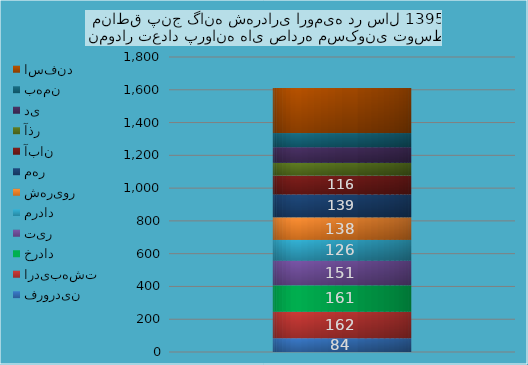
| Category | فروردین  | اردیبهشت | خرداد | تیر | مرداد | شهریور | مهر | آبان | آذر | دی | بهمن | اسفند |
|---|---|---|---|---|---|---|---|---|---|---|---|---|
| 0 | 84 | 162 | 161 | 151 | 126 | 138 | 139 | 116 | 77 | 96 | 86 | 275 |